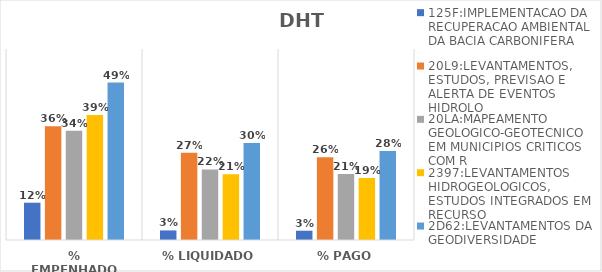
| Category | 125F:IMPLEMENTACAO DA RECUPERACAO AMBIENTAL DA BACIA CARBONIFERA | 20L9:LEVANTAMENTOS, ESTUDOS, PREVISAO E ALERTA DE EVENTOS HIDROLO | 20LA:MAPEAMENTO GEOLOGICO-GEOTECNICO EM MUNICIPIOS CRITICOS COM R | 2397:LEVANTAMENTOS HIDROGEOLOGICOS, ESTUDOS INTEGRADOS EM RECURSO | 2D62:LEVANTAMENTOS DA GEODIVERSIDADE |
|---|---|---|---|---|---|
| % EMPENHADO | 0.117 | 0.357 | 0.343 | 0.393 | 0.495 |
| % LIQUIDADO | 0.03 | 0.274 | 0.222 | 0.207 | 0.305 |
| % PAGO | 0.029 | 0.26 | 0.207 | 0.194 | 0.28 |